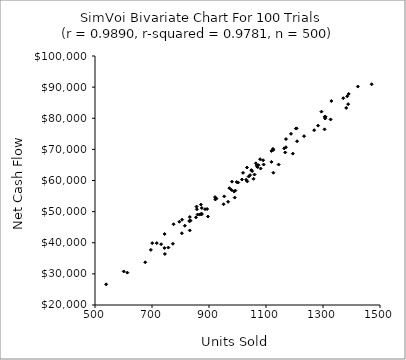
| Category | Series 0 |
|---|---|
| 854.2304992150957 | 48154.977 |
| 1169.8612101544886 | 70682.516 |
| 1371.0105038075726 | 86436.542 |
| 1079.3100416607313 | 66834.482 |
| 1282.8143712501453 | 77634.784 |
| 1059.6817778812351 | 61919.692 |
| 1124.5207805124694 | 70156.49 |
| 1422.243596117321 | 90184.727 |
| 805.4286285431208 | 47412.031 |
| 834.7279760569274 | 47153.823 |
| 1163.9249930490264 | 70315.161 |
| 953.4724346896035 | 54893.189 |
| 1002.3863059291955 | 59352.218 |
| 832.46673787131 | 43958.341 |
| 971.4091549471574 | 57531.764 |
| 676.3192585275103 | 33721.525 |
| 700.8362677956435 | 39877.598 |
| 992.2861438405348 | 56752.994 |
| 1208.8526924818707 | 72608.133 |
| 757.3443138062273 | 38446.169 |
| 1015.6611762761873 | 60314.183 |
| 1125.6151042472584 | 69834.565 |
| 1069.8917819320027 | 64337.299 |
| 832.4779355059433 | 47130.569 |
| 743.4577781368981 | 38325.851 |
| 926.0074625134736 | 54219.643 |
| 832.6524019448946 | 48262.903 |
| 1048.4379801212203 | 63352.325 |
| 1030.2035865437097 | 60252.798 |
| 1269.0459592912462 | 76166.652 |
| 1207.3383528489242 | 76750.597 |
| 1167.419868229228 | 69012.145 |
| 1307.7569829173165 | 79919.617 |
| 1125.902538398584 | 62504.389 |
| 1144.346987670863 | 65119.808 |
| 1038.9570459175025 | 61264.208 |
| 600.8797298106829 | 30782.138 |
| 874.603444996067 | 51160.156 |
| 804.8306583039259 | 43050.604 |
| 732.2427400086109 | 39518.392 |
| 990.2341857814116 | 54506.837 |
| 867.0982547768922 | 49043.354 |
| 1470.633751757023 | 90921.868 |
| 1233.5875804751317 | 74244.306 |
| 696.0218862822708 | 37711.497 |
| 922.4155705003785 | 53905.237 |
| 1294.5048946550708 | 82120.994 |
| 1119.1458730094935 | 65974.258 |
| 871.6810285204074 | 52260.231 |
| 538.9908018000363 | 26633.522 |
| 1090.0064026605994 | 66494.181 |
| 1381.4380059949115 | 83312.582 |
| 1034.4274075580267 | 59711.915 |
| 886.1509308388434 | 50778.428 |
| 951.0627538148608 | 52375.896 |
| 997.1800475709239 | 59511.311 |
| 613.5506962878214 | 30399.982 |
| 893.3244129630722 | 50832.575 |
| 979.2113113560837 | 56965.683 |
| 1187.6953989895499 | 75000.899 |
| 745.3334934036423 | 36397.464 |
| 1033.2367039437734 | 64164.308 |
| 966.9189485038161 | 53162.491 |
| 1204.8465738497155 | 76683.565 |
| 1308.8626778755079 | 80473.889 |
| 1388.136836670917 | 84532.355 |
| 831.9991147940208 | 46867.553 |
| 773.3525200595174 | 39668.014 |
| 1119.056043201873 | 69491.076 |
| 896.2870831988334 | 48421.043 |
| 980.6104859028452 | 59624.231 |
| 775.6312556755869 | 45949.343 |
| 744.2718811806145 | 42811.344 |
| 1329.3307403705946 | 85524.032 |
| 988.2144326386576 | 56458.652 |
| 1043.8988304091743 | 61718.995 |
| 815.30414517674 | 45467.778 |
| 1073.694357936928 | 64909.654 |
| 859.8738140657605 | 49068.584 |
| 1051.3923178232073 | 63024.923 |
| 1305.4874969343787 | 76433.511 |
| 856.3551125800636 | 51620.015 |
| 716.7415929467866 | 39893.698 |
| 1019.4637411597444 | 62462.529 |
| 1326.6852542907861 | 79619.578 |
| 1390.1126832711989 | 87814.651 |
| 921.2321974917412 | 54668.487 |
| 1091.6443304564064 | 65126.774 |
| 1080.9036500692785 | 63850.068 |
| 795.8772844647125 | 46750.599 |
| 1385.0025651443389 | 87060.518 |
| 1305.7105710319795 | 80461.872 |
| 857.5931844233969 | 50763.754 |
| 873.9411724435046 | 49094.751 |
| 1194.1909050114357 | 68637.506 |
| 1067.4961717098668 | 64732.779 |
| 1170.0797885633278 | 73323.767 |
| 873.6827009415773 | 49394.483 |
| 1056.208619638397 | 60547.096 |
| 1064.546339232998 | 65516.219 |